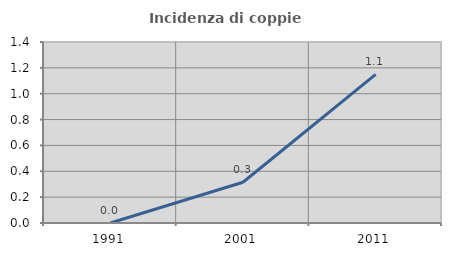
| Category | Incidenza di coppie miste |
|---|---|
| 1991.0 | 0 |
| 2001.0 | 0.315 |
| 2011.0 | 1.149 |